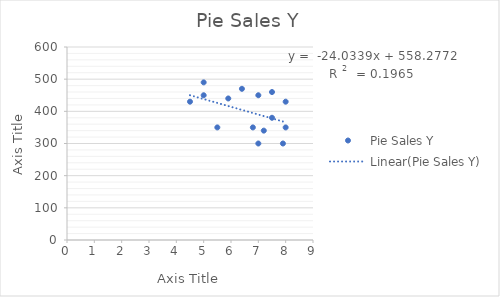
| Category | Pie Sales Y |
|---|---|
| 5.5 | 350 |
| 7.5 | 460 |
| 8.0 | 350 |
| 8.0 | 430 |
| 6.8 | 350 |
| 7.5 | 380 |
| 4.5 | 430 |
| 6.4 | 470 |
| 7.0 | 450 |
| 5.0 | 490 |
| 7.2 | 340 |
| 7.9 | 300 |
| 5.9 | 440 |
| 5.0 | 450 |
| 7.0 | 300 |